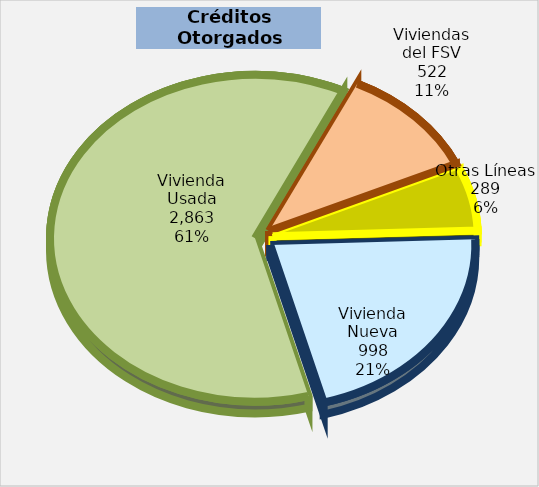
| Category | Series 0 |
|---|---|
| Vivienda Nueva | 998 |
| Vivienda Usada | 2863 |
| Viviendas del FSV | 522 |
| Otras Líneas | 289 |